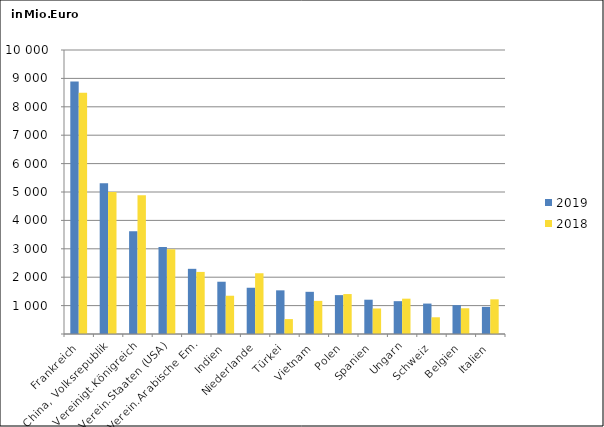
| Category | 2019 | 2018 |
|---|---|---|
| Frankreich | 8889.219 | 8490.829 |
| China, Volksrepublik | 5304.198 | 5002.405 |
| Vereinigt.Königreich | 3620.797 | 4886.773 |
| Verein.Staaten (USA) | 3067.023 | 2982.867 |
| Verein.Arabische Em. | 2295.134 | 2185.762 |
| Indien | 1840.282 | 1347.188 |
| Niederlande | 1628.452 | 2139.072 |
| Türkei | 1537.303 | 524.941 |
| Vietnam | 1485.255 | 1166.606 |
| Polen | 1368.94 | 1406.582 |
| Spanien | 1207.304 | 898.526 |
| Ungarn | 1155.759 | 1243.728 |
| Schweiz | 1071.526 | 588.902 |
| Belgien | 1016.244 | 906.212 |
| Italien | 955.219 | 1221.41 |